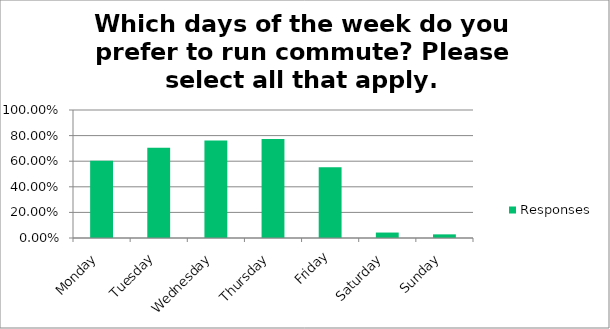
| Category | Responses |
|---|---|
| Monday | 0.603 |
| Tuesday | 0.706 |
| Wednesday | 0.762 |
| Thursday | 0.773 |
| Friday | 0.553 |
| Saturday | 0.043 |
| Sunday | 0.028 |